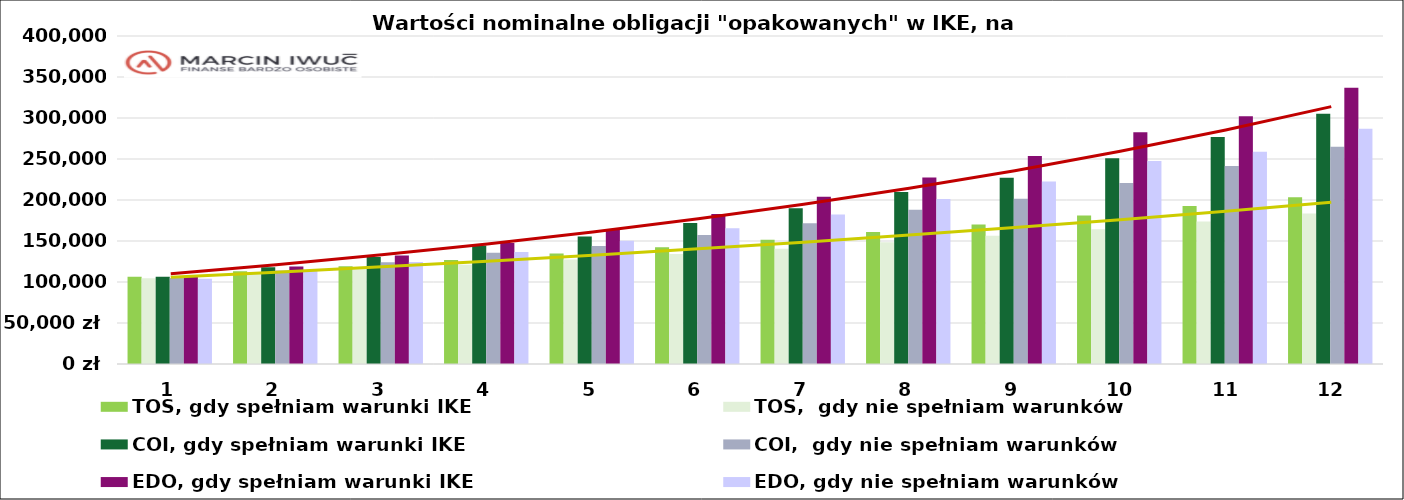
| Category | TOS, gdy spełniam warunki IKE | TOS,  gdy nie spełniam warunków | COI, gdy spełniam warunki IKE | COI,  gdy nie spełniam warunków | EDO, gdy spełniam warunki IKE | EDO, gdy nie spełniam warunków |
|---|---|---|---|---|---|---|
| 0 | 106400 | 104617 | 106550 | 104738.5 | 106800 | 103888 |
| 1 | 113028.465 | 109951.641 | 118036.589 | 113969.841 | 118891.469 | 113645.889 |
| 2 | 119245.398 | 115520.269 | 130587.729 | 124032.598 | 132386.734 | 124539.212 |
| 3 | 126847.557 | 120965.434 | 144517.079 | 135772.363 | 147456.024 | 136707.337 |
| 4 | 134822.45 | 127391.619 | 155391.279 | 143894.384 | 164281.281 | 150297.796 |
| 5 | 142307.039 | 134100.187 | 171941.229 | 157200.04 | 183064.444 | 165474.157 |
| 6 | 151453.779 | 140664.662 | 189864.679 | 171584.779 | 204030.67 | 182418.8 |
| 7 | 161049.67 | 148406.502 | 209717.279 | 188155.829 | 227431.012 | 201335.077 |
| 8 | 170044.196 | 156472.007 | 227082.679 | 201438.198 | 253545.393 | 222449.726 |
| 9 | 181015.509 | 164351.108 | 250981.979 | 220659.973 | 282685.928 | 247635.56 |
| 10 | 192611.646 | 173706.48 | 276767.029 | 241371.216 | 302130.228 | 258746.764 |
| 11 | 203499.073 | 183459.134 | 305281.979 | 264985.419 | 336897.082 | 286869.916 |